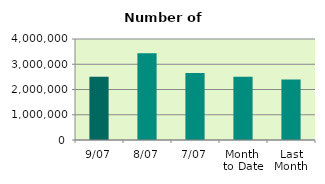
| Category | Series 0 |
|---|---|
| 9/07 | 2502646 |
| 8/07 | 3435384 |
| 7/07 | 2655522 |
| Month 
to Date | 2508356.857 |
| Last
Month | 2394428.455 |